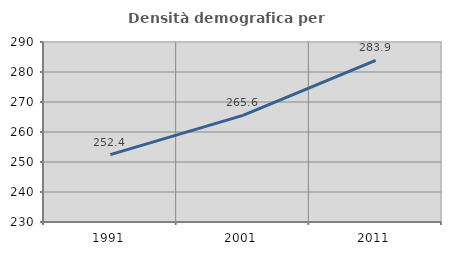
| Category | Densità demografica |
|---|---|
| 1991.0 | 252.442 |
| 2001.0 | 265.558 |
| 2011.0 | 283.869 |